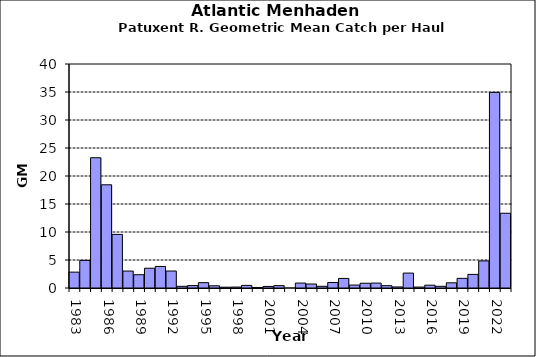
| Category | Series 0 |
|---|---|
| 1983.0 | 2.834 |
| 1984.0 | 4.929 |
| 1985.0 | 23.26 |
| 1986.0 | 18.426 |
| 1987.0 | 9.571 |
| 1988.0 | 3.026 |
| 1989.0 | 2.375 |
| 1990.0 | 3.531 |
| 1991.0 | 3.848 |
| 1992.0 | 3.032 |
| 1993.0 | 0.302 |
| 1994.0 | 0.432 |
| 1995.0 | 0.952 |
| 1996.0 | 0.396 |
| 1997.0 | 0.142 |
| 1998.0 | 0.167 |
| 1999.0 | 0.466 |
| 2000.0 | 0.08 |
| 2001.0 | 0.282 |
| 2002.0 | 0.422 |
| 2003.0 | 0 |
| 2004.0 | 0.88 |
| 2005.0 | 0.714 |
| 2006.0 | 0.305 |
| 2007.0 | 0.98 |
| 2008.0 | 1.71 |
| 2009.0 | 0.525 |
| 2010.0 | 0.85 |
| 2011.0 | 0.877 |
| 2012.0 | 0.417 |
| 2013.0 | 0.187 |
| 2014.0 | 2.664 |
| 2015.0 | 0.167 |
| 2016.0 | 0.503 |
| 2017.0 | 0.303 |
| 2018.0 | 0.927 |
| 2019.0 | 1.72 |
| 2020.0 | 2.43 |
| 2021.0 | 4.841 |
| 2022.0 | 34.931 |
| 2023.0 | 13.35 |